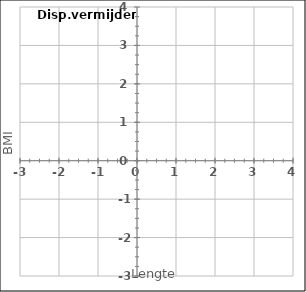
| Category | Series 10 |
|---|---|
| #N/A | 0 |